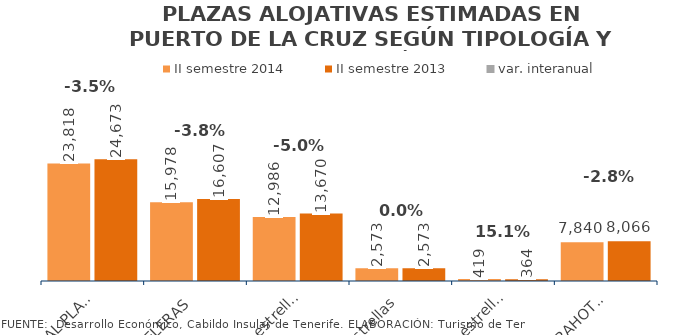
| Category | II semestre 2014 | II semestre 2013 |
|---|---|---|
| TOTAL PLAZAS | 23818 | 24673 |
| HOTELERAS | 15978 | 16607 |
| 4 y 5 estrellas | 12986 | 13670 |
| 3 estrellas | 2573 | 2573 |
| 1 Y 2 estrellas | 419 | 364 |
| EXTRAHOTELERAS | 7840 | 8066 |